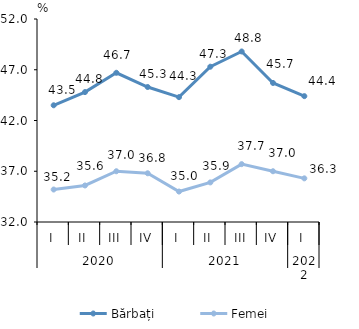
| Category | Bărbați | Femei |
|---|---|---|
| 0 | 43.5 | 35.2 |
| 1 | 44.8 | 35.6 |
| 2 | 46.7 | 37 |
| 3 | 45.3 | 36.8 |
| 4 | 44.3 | 35 |
| 5 | 47.3 | 35.9 |
| 6 | 48.8 | 37.7 |
| 7 | 45.7 | 37 |
| 8 | 44.4 | 36.3 |